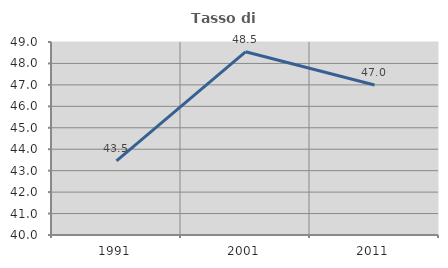
| Category | Tasso di occupazione   |
|---|---|
| 1991.0 | 43.459 |
| 2001.0 | 48.544 |
| 2011.0 | 46.995 |